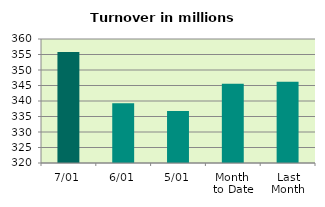
| Category | Series 0 |
|---|---|
| 7/01 | 355.817 |
| 6/01 | 339.309 |
| 5/01 | 336.801 |
| Month 
to Date | 345.554 |
| Last
Month | 346.191 |